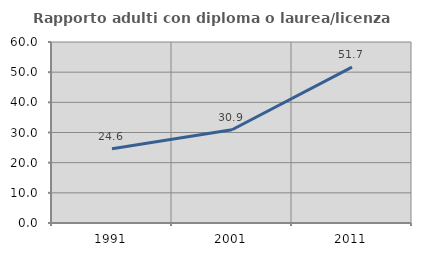
| Category | Rapporto adulti con diploma o laurea/licenza media  |
|---|---|
| 1991.0 | 24.638 |
| 2001.0 | 30.918 |
| 2011.0 | 51.653 |